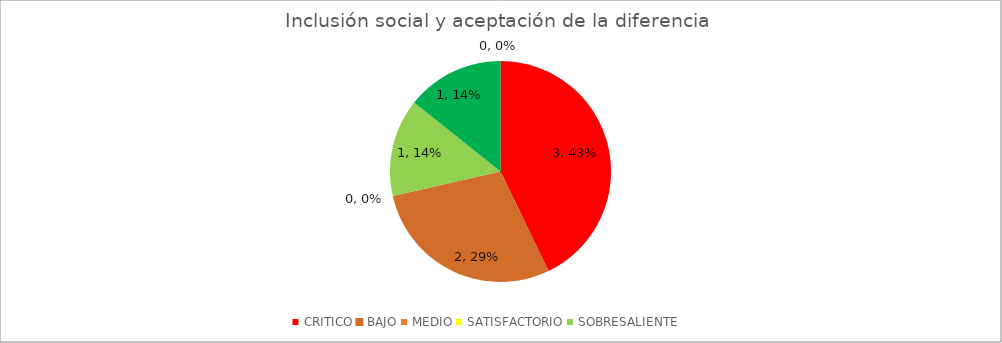
| Category | Inclusión social y aceptación de la diferencia  |
|---|---|
| CRITICO | 3 |
| BAJO | 2 |
| MEDIO | 0 |
| SATISFACTORIO | 1 |
| SOBRESALIENTE | 1 |